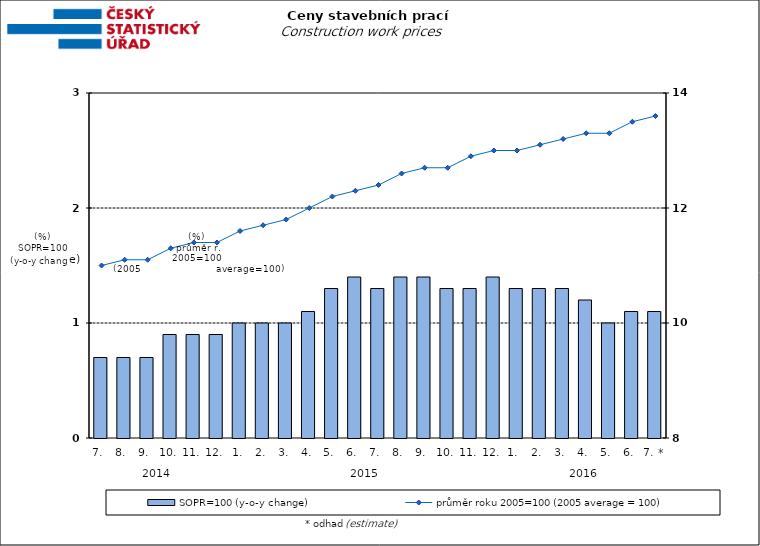
| Category | SOPR=100 (y-o-y change)   |
|---|---|
| 0 | 0.7 |
| 1 | 0.7 |
| 2 | 0.7 |
| 3 | 0.9 |
| 4 | 0.9 |
| 5 | 0.9 |
| 6 | 1 |
| 7 | 1 |
| 8 | 1 |
| 9 | 1.1 |
| 10 | 1.3 |
| 11 | 1.4 |
| 12 | 1.3 |
| 13 | 1.4 |
| 14 | 1.4 |
| 15 | 1.3 |
| 16 | 1.3 |
| 17 | 1.4 |
| 18 | 1.3 |
| 19 | 1.3 |
| 20 | 1.3 |
| 21 | 1.2 |
| 22 | 1 |
| 23 | 1.1 |
| 24 | 1.1 |